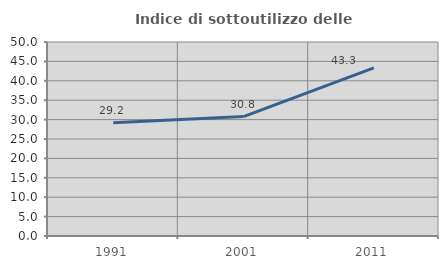
| Category | Indice di sottoutilizzo delle abitazioni  |
|---|---|
| 1991.0 | 29.167 |
| 2001.0 | 30.769 |
| 2011.0 | 43.35 |